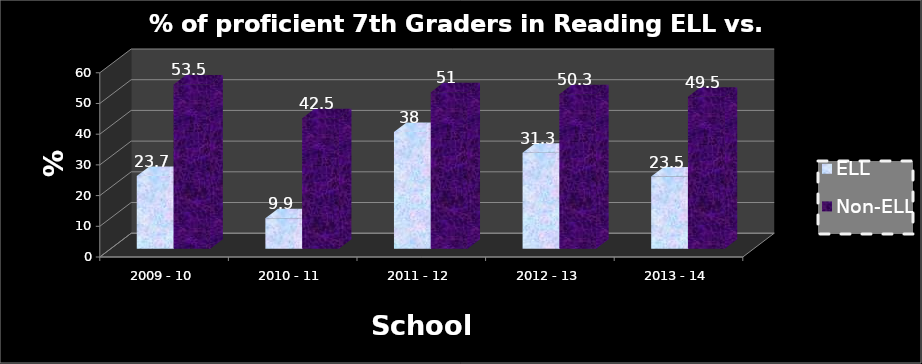
| Category | ELL | Non-ELL |
|---|---|---|
| 2009 - 10 | 23.7 | 53.5 |
| 2010 - 11 | 9.9 | 42.5 |
| 2011 - 12 | 38 | 51 |
| 2012 - 13 | 31.3 | 50.3 |
| 2013 - 14 | 23.5 | 49.5 |